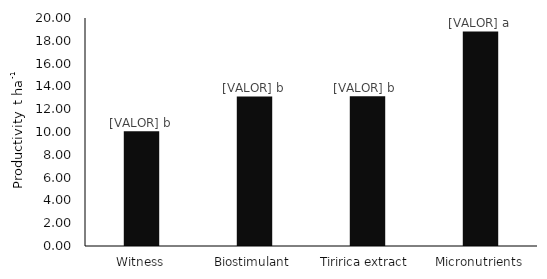
| Category | Series 0 |
|---|---|
| Witness | 10.063 |
| Biostimulant | 13.125 |
| Tiririca extract  | 13.141 |
| Micronutrients | 18.818 |